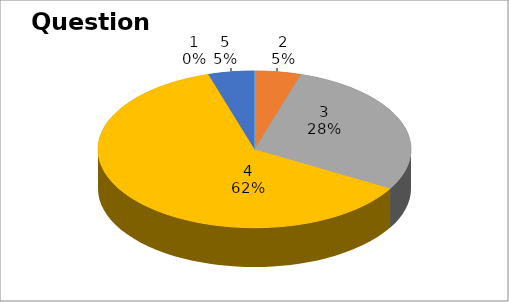
| Category | Series 0 |
|---|---|
| 0 | 0 |
| 1 | 1 |
| 2 | 6 |
| 3 | 13 |
| 4 | 1 |